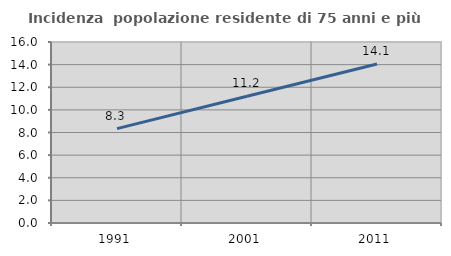
| Category | Incidenza  popolazione residente di 75 anni e più |
|---|---|
| 1991.0 | 8.345 |
| 2001.0 | 11.208 |
| 2011.0 | 14.054 |